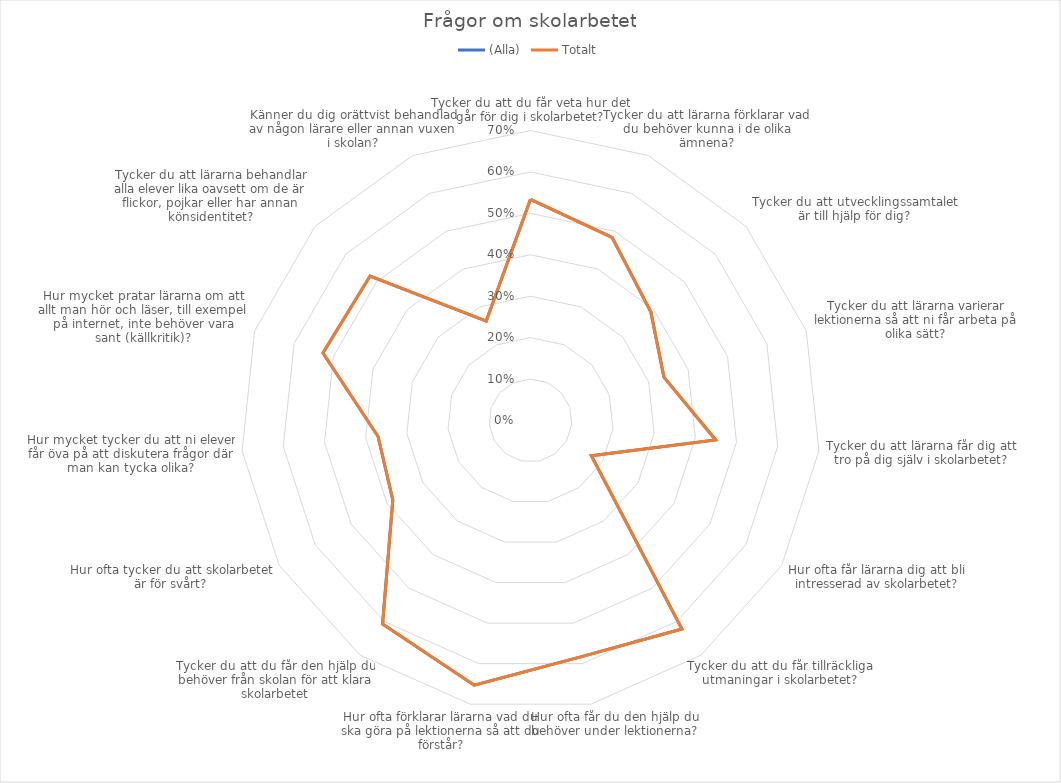
| Category | (Alla) | Totalt |
|---|---|---|
| Tycker du att du får veta hur det går för dig i skolarbetet? | 0.534 | 0.534 |
| Tycker du att lärarna förklarar vad du behöver kunna i de olika ämnena? | 0.484 | 0.484 |
| Tycker du att utvecklingssamtalet är till hjälp för dig? | 0.391 | 0.391 |
| Tycker du att lärarna varierar lektionerna så att ni får arbeta på olika sätt? | 0.339 | 0.339 |
| Tycker du att lärarna får dig att tro på dig själv i skolarbetet? | 0.449 | 0.449 |
| Hur ofta får lärarna dig att bli intresserad av skolarbetet? | 0.17 | 0.17 |
| Tycker du att du får tillräckliga utmaningar i skolarbetet? | 0.622 | 0.622 |
| Hur ofta får du den hjälp du behöver under lektionerna? | 0.583 | 0.583 |
| Hur ofta förklarar lärarna vad du ska göra på lektionerna så att du förstår? | 0.653 | 0.653 |
| Tycker du att du får den hjälp du behöver från skolan för att klara skolarbetet | 0.607 | 0.607 |
| Hur ofta tycker du att skolarbetet är för svårt? | 0.384 | 0.384 |
| Hur mycket tycker du att ni elever får öva på att diskutera frågor där man kan tycka olika? | 0.37 | 0.37 |
| Hur mycket pratar lärarna om att allt man hör och läser, till exempel på internet, inte behöver vara sant (källkritik)? | 0.527 | 0.527 |
| Tycker du att lärarna behandlar alla elever lika oavsett om de är flickor, pojkar eller har annan könsidentitet? | 0.521 | 0.521 |
| Känner du dig orättvist behandlad av någon lärare eller annan vuxen i skolan? | 0.263 | 0.263 |